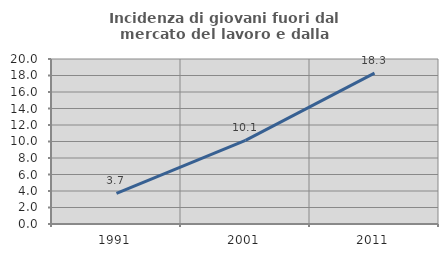
| Category | Incidenza di giovani fuori dal mercato del lavoro e dalla formazione  |
|---|---|
| 1991.0 | 3.704 |
| 2001.0 | 10.145 |
| 2011.0 | 18.28 |